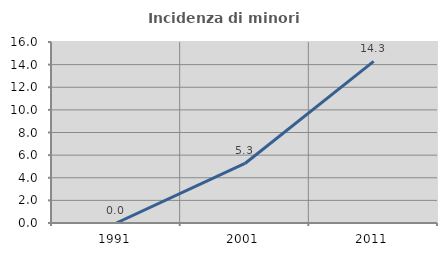
| Category | Incidenza di minori stranieri |
|---|---|
| 1991.0 | 0 |
| 2001.0 | 5.263 |
| 2011.0 | 14.286 |